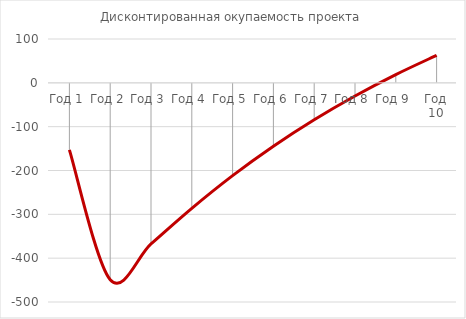
| Category | Дисконтированная окупаемость проекта |
|---|---|
| Год 1 | -153 |
| Год 2 | -449.216 |
| Год 3 | -367.453 |
| Год 4 | -286.27 |
| Год 5 | -211.676 |
| Год 6 | -144.58 |
| Год 7 | -84.237 |
| Год 8 | -29.976 |
| Год 9 | 18.81 |
| Год 10 | 62.667 |